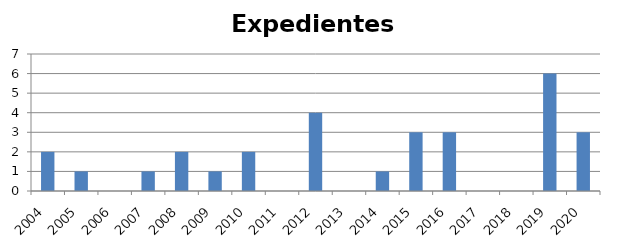
| Category | Expedientes Disciplinarios |
|---|---|
| 2004.0 | 2 |
| 2005.0 | 1 |
| 2006.0 | 0 |
| 2007.0 | 1 |
| 2008.0 | 2 |
| 2009.0 | 1 |
| 2010.0 | 2 |
| 2011.0 | 0 |
| 2012.0 | 4 |
| 2013.0 | 0 |
| 2014.0 | 1 |
| 2015.0 | 3 |
| 2016.0 | 3 |
| 2017.0 | 0 |
| 2018.0 | 0 |
| 2019.0 | 6 |
| 2020.0 | 3 |